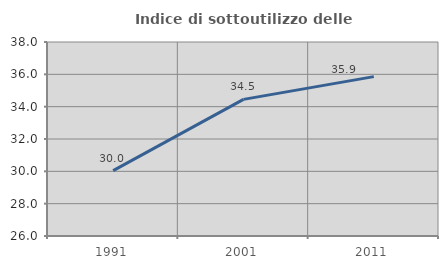
| Category | Indice di sottoutilizzo delle abitazioni  |
|---|---|
| 1991.0 | 30.046 |
| 2001.0 | 34.452 |
| 2011.0 | 35.857 |